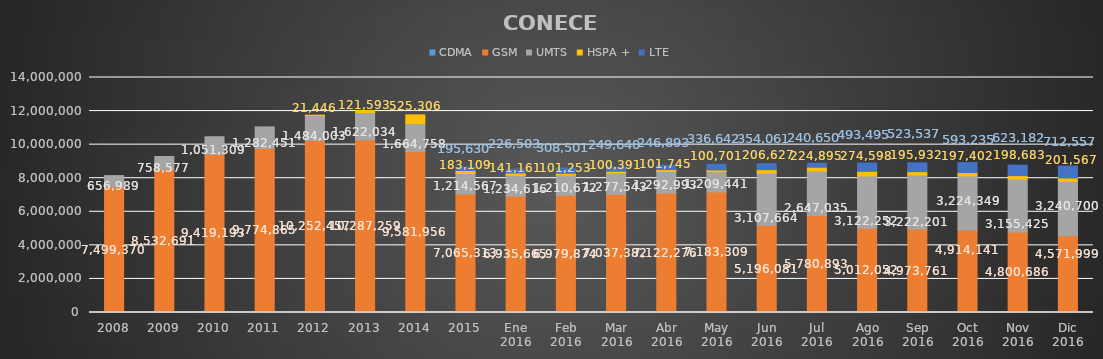
| Category | CDMA | GSM | UMTS | HSPA + | LTE |
|---|---|---|---|---|---|
| 2008 | 0 | 7499370 | 656989 | 0 | 0 |
| 2009 | 0 | 8532691 | 758577 | 0 | 0 |
| 2010 | 0 | 9419193 | 1051309 | 0 | 0 |
| 2011 | 0 | 9774865 | 1282451 | 0 | 0 |
| 2012 | 0 | 10252457 | 1484003 | 21446 | 0 |
| 2013 | 0 | 10287259 | 1622034 | 121593 | 0 |
| 2014 | 0 | 9581956 | 1664758 | 525306 | 0 |
| 2015 | 0 | 7065313 | 1214567 | 183109 | 195630 |
| Ene 2016 | 0 | 6935665 | 1234616 | 141161 | 226503 |
| Feb 2016 | 0 | 6979874 | 1210672 | 101253 | 308501 |
| Mar 2016 | 0 | 7037382 | 1277543 | 100391 | 249640 |
| Abr 2016 | 0 | 7122276 | 1292993 | 101745 | 246893 |
| May 2016 | 0 | 7183309 | 1209441 | 100701 | 336642 |
| Jun 2016 | 0 | 5196081 | 3107664 | 206627 | 354061 |
| Jul 2016 | 0 | 5780893 | 2647035 | 224895 | 240650 |
| Ago 2016 | 0 | 5012052 | 3122252 | 274598 | 493495 |
| Sep 2016 | 0 | 4973761 | 3222201 | 195932 | 523537 |
| Oct 2016 | 0 | 4914141 | 3224349 | 197402 | 593235 |
| Nov 2016 | 0 | 4800686 | 3155425 | 198683 | 623182 |
| Dic 2016 | 0 | 4571999 | 3240700 | 201567 | 712557 |